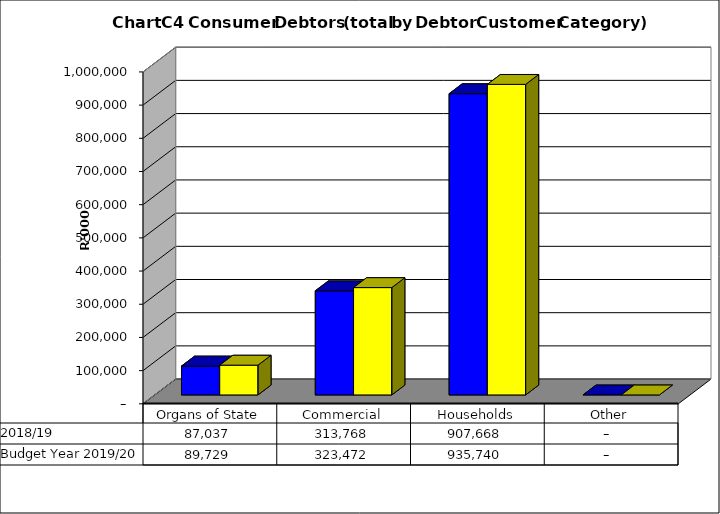
| Category |  2018/19  | Budget Year 2019/20 |
|---|---|---|
| Organs of State | 87036922.42 | 89728786 |
| Commercial | 313768002.96 | 323472168 |
| Households | 907667713.67 | 935739911 |
| Other | 0 | 0 |